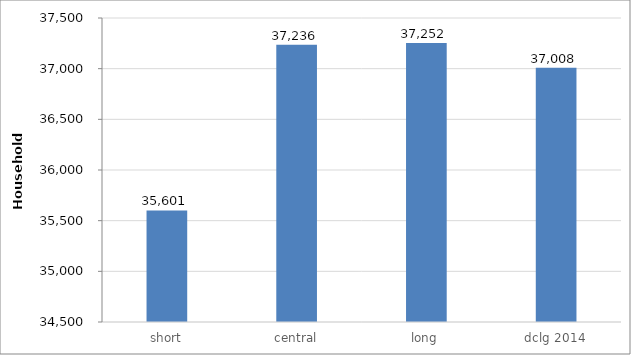
| Category | annualised |
|---|---|
| short | 35600.879 |
| central | 37236.001 |
| long | 37252.184 |
| dclg 2014 | 37007.814 |